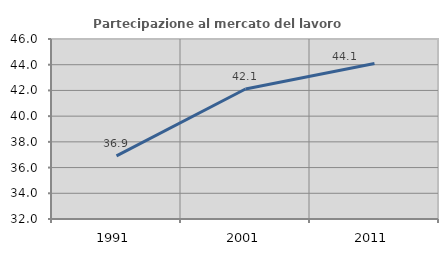
| Category | Partecipazione al mercato del lavoro  femminile |
|---|---|
| 1991.0 | 36.905 |
| 2001.0 | 42.109 |
| 2011.0 | 44.1 |